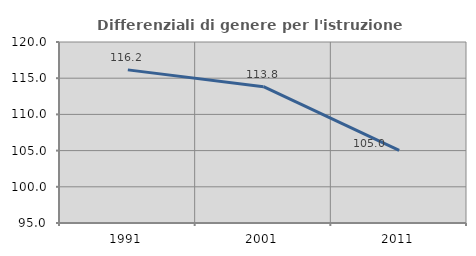
| Category | Differenziali di genere per l'istruzione superiore |
|---|---|
| 1991.0 | 116.151 |
| 2001.0 | 113.834 |
| 2011.0 | 105.04 |